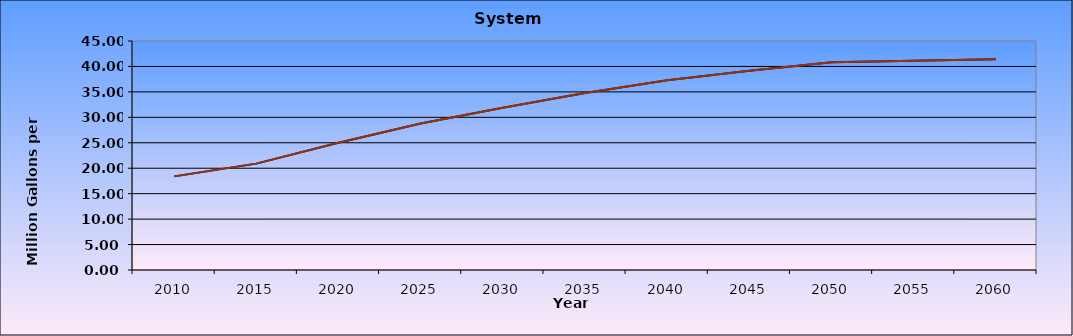
| Category | Series 0 | Series 1 |
|---|---|---|
| 2010.0 | 18.4 | 18.4 |
| 2015.0 | 20.9 | 20.9 |
| 2020.0 | 25 | 25 |
| 2025.0 | 28.8 | 28.8 |
| 2030.0 | 31.9 | 31.9 |
| 2035.0 | 34.8 | 34.8 |
| 2040.0 | 37.3 | 37.3 |
| 2045.0 | 39.15 | 39.15 |
| 2050.0 | 40.8 | 40.8 |
| 2055.0 | 41.1 | 41.1 |
| 2060.0 | 41.4 | 41.4 |